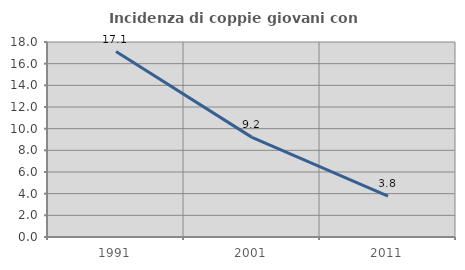
| Category | Incidenza di coppie giovani con figli |
|---|---|
| 1991.0 | 17.114 |
| 2001.0 | 9.195 |
| 2011.0 | 3.782 |